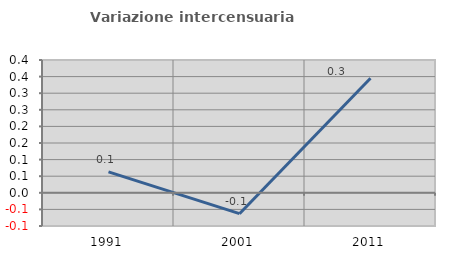
| Category | Variazione intercensuaria annua |
|---|---|
| 1991.0 | 0.063 |
| 2001.0 | -0.063 |
| 2011.0 | 0.345 |